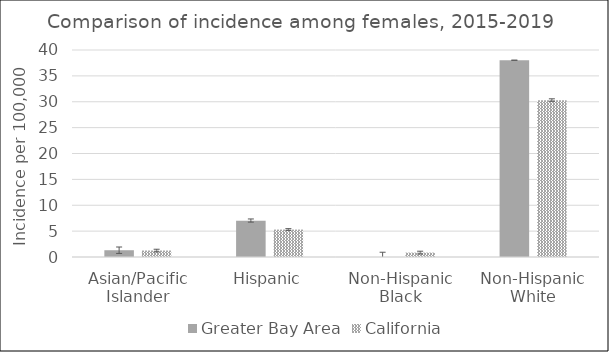
| Category | Greater Bay Area | California | SEER 18 |
|---|---|---|---|
| Asian/Pacific Islander | 1.31 | 1.25 |  |
| Hispanic | 7.02 | 5.3 |  |
| Non-Hispanic Black | 0 | 0.85 |  |
| Non-Hispanic White | 38.02 | 30.31 |  |